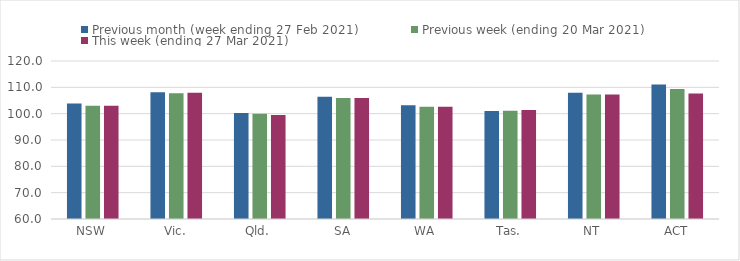
| Category | Previous month (week ending 27 Feb 2021) | Previous week (ending 20 Mar 2021) | This week (ending 27 Mar 2021) |
|---|---|---|---|
| NSW | 103.9 | 103.04 | 103.04 |
| Vic. | 108.15 | 107.77 | 107.96 |
| Qld. | 100.26 | 99.97 | 99.53 |
| SA | 106.45 | 105.97 | 105.97 |
| WA | 103.17 | 102.67 | 102.67 |
| Tas. | 100.98 | 101.08 | 101.36 |
| NT | 107.97 | 107.29 | 107.29 |
| ACT | 111.11 | 109.4 | 107.68 |